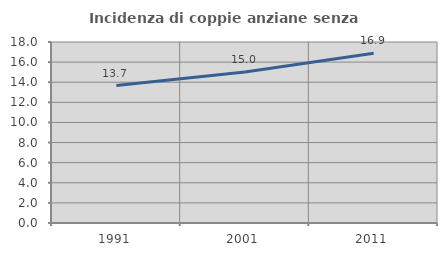
| Category | Incidenza di coppie anziane senza figli  |
|---|---|
| 1991.0 | 13.665 |
| 2001.0 | 15.017 |
| 2011.0 | 16.883 |